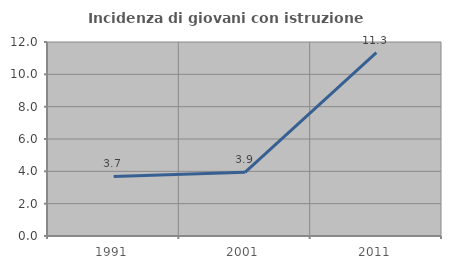
| Category | Incidenza di giovani con istruzione universitaria |
|---|---|
| 1991.0 | 3.687 |
| 2001.0 | 3.937 |
| 2011.0 | 11.34 |